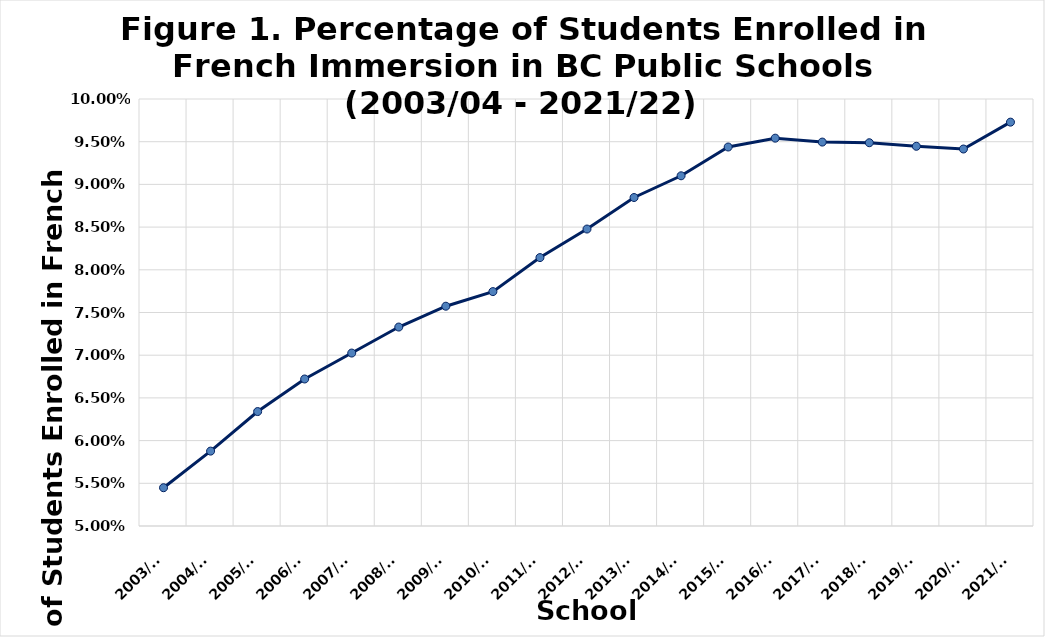
| Category | % of students in FI |
|---|---|
| 2003/04 | 0.054 |
| 2004/05 | 0.059 |
| 2005/06 | 0.063 |
| 2006/07 | 0.067 |
| 2007/08 | 0.07 |
| 2008/09 | 0.073 |
| 2009/10 | 0.076 |
| 2010/11 | 0.077 |
| 2011/12 | 0.081 |
| 2012/13 | 0.085 |
| 2013/14 | 0.088 |
| 2014/15 | 0.091 |
| 2015/16 | 0.094 |
| 2016/17 | 0.095 |
| 2017/18 | 0.095 |
| 2018/19 | 0.095 |
| 2019/20 | 0.094 |
| 2020/21 | 0.094 |
| 2021/22 | 0.097 |